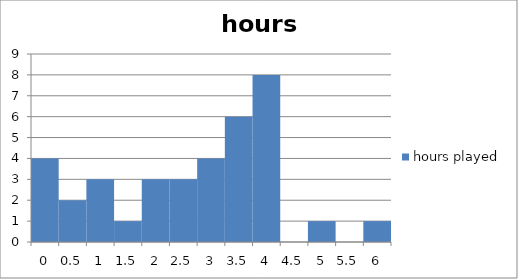
| Category | hours played |
|---|---|
| 0.0 | 4 |
| 0.5 | 2 |
| 1.0 | 3 |
| 1.5 | 1 |
| 2.0 | 3 |
| 2.5 | 3 |
| 3.0 | 4 |
| 3.5 | 6 |
| 4.0 | 8 |
| 4.5 | 0 |
| 5.0 | 1 |
| 5.5 | 0 |
| 6.0 | 1 |